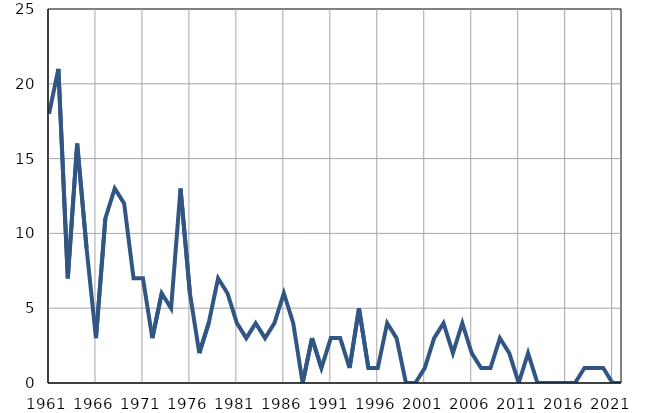
| Category | Умрла 
одојчад |
|---|---|
| 1961.0 | 18 |
| 1962.0 | 21 |
| 1963.0 | 7 |
| 1964.0 | 16 |
| 1965.0 | 9 |
| 1966.0 | 3 |
| 1967.0 | 11 |
| 1968.0 | 13 |
| 1969.0 | 12 |
| 1970.0 | 7 |
| 1971.0 | 7 |
| 1972.0 | 3 |
| 1973.0 | 6 |
| 1974.0 | 5 |
| 1975.0 | 13 |
| 1976.0 | 6 |
| 1977.0 | 2 |
| 1978.0 | 4 |
| 1979.0 | 7 |
| 1980.0 | 6 |
| 1981.0 | 4 |
| 1982.0 | 3 |
| 1983.0 | 4 |
| 1984.0 | 3 |
| 1985.0 | 4 |
| 1986.0 | 6 |
| 1987.0 | 4 |
| 1988.0 | 0 |
| 1989.0 | 3 |
| 1990.0 | 1 |
| 1991.0 | 3 |
| 1992.0 | 3 |
| 1993.0 | 1 |
| 1994.0 | 5 |
| 1995.0 | 1 |
| 1996.0 | 1 |
| 1997.0 | 4 |
| 1998.0 | 3 |
| 1999.0 | 0 |
| 2000.0 | 0 |
| 2001.0 | 1 |
| 2002.0 | 3 |
| 2003.0 | 4 |
| 2004.0 | 2 |
| 2005.0 | 4 |
| 2006.0 | 2 |
| 2007.0 | 1 |
| 2008.0 | 1 |
| 2009.0 | 3 |
| 2010.0 | 2 |
| 2011.0 | 0 |
| 2012.0 | 2 |
| 2013.0 | 0 |
| 2014.0 | 0 |
| 2015.0 | 0 |
| 2016.0 | 0 |
| 2017.0 | 0 |
| 2018.0 | 1 |
| 2019.0 | 1 |
| 2020.0 | 1 |
| 2021.0 | 0 |
| 2022.0 | 0 |